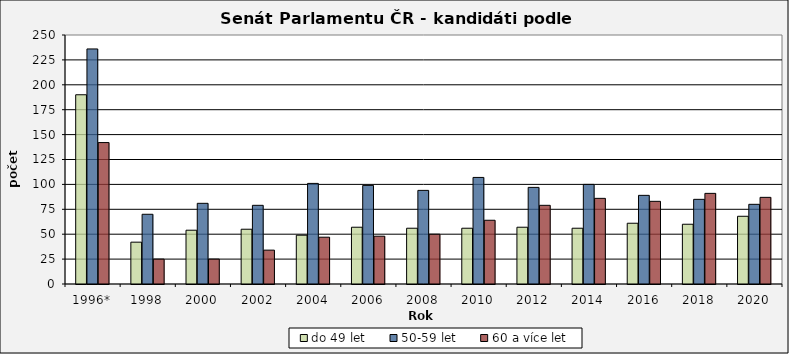
| Category | do 49 let | 50-59 let | 60 a více let |
|---|---|---|---|
| 1996* | 190 | 236 | 142 |
| 1998 | 42 | 70 | 25 |
| 2000 | 54 | 81 | 25 |
| 2002 | 55 | 79 | 34 |
| 2004 | 49 | 101 | 47 |
| 2006 | 57 | 99 | 48 |
| 2008 | 56 | 94 | 50 |
| 2010 | 56 | 107 | 64 |
| 2012 | 57 | 97 | 79 |
| 2014 | 56 | 100 | 86 |
| 2016 | 61 | 89 | 83 |
| 2018 | 60 | 85 | 91 |
| 2020 | 68 | 80 | 87 |